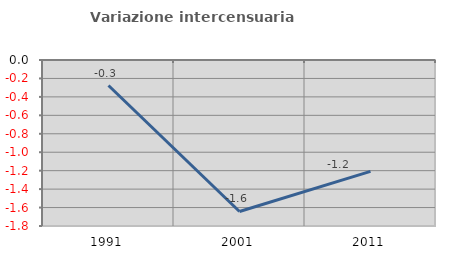
| Category | Variazione intercensuaria annua |
|---|---|
| 1991.0 | -0.277 |
| 2001.0 | -1.642 |
| 2011.0 | -1.208 |